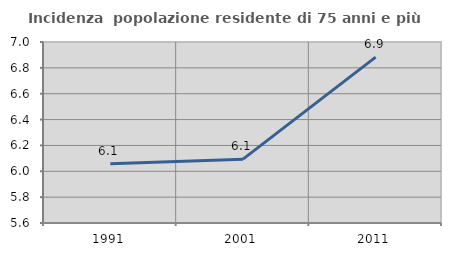
| Category | Incidenza  popolazione residente di 75 anni e più |
|---|---|
| 1991.0 | 6.058 |
| 2001.0 | 6.094 |
| 2011.0 | 6.883 |